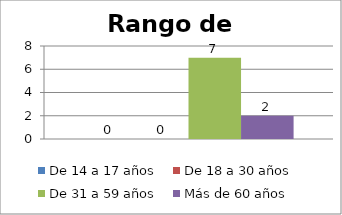
| Category | De 14 a 17 años | De 18 a 30 años  | De 31 a 59 años  | Más de 60 años  |
|---|---|---|---|---|
| 0 | 0 | 0 | 7 | 2 |